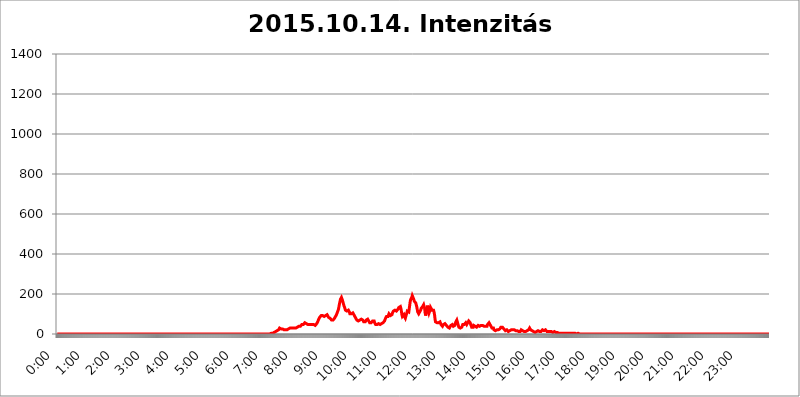
| Category | 2015.10.14. Intenzitás [W/m^2] |
|---|---|
| 0.0 | 0 |
| 0.0006944444444444445 | 0 |
| 0.001388888888888889 | 0 |
| 0.0020833333333333333 | 0 |
| 0.002777777777777778 | 0 |
| 0.003472222222222222 | 0 |
| 0.004166666666666667 | 0 |
| 0.004861111111111111 | 0 |
| 0.005555555555555556 | 0 |
| 0.0062499999999999995 | 0 |
| 0.006944444444444444 | 0 |
| 0.007638888888888889 | 0 |
| 0.008333333333333333 | 0 |
| 0.009027777777777779 | 0 |
| 0.009722222222222222 | 0 |
| 0.010416666666666666 | 0 |
| 0.011111111111111112 | 0 |
| 0.011805555555555555 | 0 |
| 0.012499999999999999 | 0 |
| 0.013194444444444444 | 0 |
| 0.013888888888888888 | 0 |
| 0.014583333333333332 | 0 |
| 0.015277777777777777 | 0 |
| 0.015972222222222224 | 0 |
| 0.016666666666666666 | 0 |
| 0.017361111111111112 | 0 |
| 0.018055555555555557 | 0 |
| 0.01875 | 0 |
| 0.019444444444444445 | 0 |
| 0.02013888888888889 | 0 |
| 0.020833333333333332 | 0 |
| 0.02152777777777778 | 0 |
| 0.022222222222222223 | 0 |
| 0.02291666666666667 | 0 |
| 0.02361111111111111 | 0 |
| 0.024305555555555556 | 0 |
| 0.024999999999999998 | 0 |
| 0.025694444444444447 | 0 |
| 0.02638888888888889 | 0 |
| 0.027083333333333334 | 0 |
| 0.027777777777777776 | 0 |
| 0.02847222222222222 | 0 |
| 0.029166666666666664 | 0 |
| 0.029861111111111113 | 0 |
| 0.030555555555555555 | 0 |
| 0.03125 | 0 |
| 0.03194444444444445 | 0 |
| 0.03263888888888889 | 0 |
| 0.03333333333333333 | 0 |
| 0.034027777777777775 | 0 |
| 0.034722222222222224 | 0 |
| 0.035416666666666666 | 0 |
| 0.036111111111111115 | 0 |
| 0.03680555555555556 | 0 |
| 0.0375 | 0 |
| 0.03819444444444444 | 0 |
| 0.03888888888888889 | 0 |
| 0.03958333333333333 | 0 |
| 0.04027777777777778 | 0 |
| 0.04097222222222222 | 0 |
| 0.041666666666666664 | 0 |
| 0.042361111111111106 | 0 |
| 0.04305555555555556 | 0 |
| 0.043750000000000004 | 0 |
| 0.044444444444444446 | 0 |
| 0.04513888888888889 | 0 |
| 0.04583333333333334 | 0 |
| 0.04652777777777778 | 0 |
| 0.04722222222222222 | 0 |
| 0.04791666666666666 | 0 |
| 0.04861111111111111 | 0 |
| 0.049305555555555554 | 0 |
| 0.049999999999999996 | 0 |
| 0.05069444444444445 | 0 |
| 0.051388888888888894 | 0 |
| 0.052083333333333336 | 0 |
| 0.05277777777777778 | 0 |
| 0.05347222222222222 | 0 |
| 0.05416666666666667 | 0 |
| 0.05486111111111111 | 0 |
| 0.05555555555555555 | 0 |
| 0.05625 | 0 |
| 0.05694444444444444 | 0 |
| 0.057638888888888885 | 0 |
| 0.05833333333333333 | 0 |
| 0.05902777777777778 | 0 |
| 0.059722222222222225 | 0 |
| 0.06041666666666667 | 0 |
| 0.061111111111111116 | 0 |
| 0.06180555555555556 | 0 |
| 0.0625 | 0 |
| 0.06319444444444444 | 0 |
| 0.06388888888888888 | 0 |
| 0.06458333333333334 | 0 |
| 0.06527777777777778 | 0 |
| 0.06597222222222222 | 0 |
| 0.06666666666666667 | 0 |
| 0.06736111111111111 | 0 |
| 0.06805555555555555 | 0 |
| 0.06874999999999999 | 0 |
| 0.06944444444444443 | 0 |
| 0.07013888888888889 | 0 |
| 0.07083333333333333 | 0 |
| 0.07152777777777779 | 0 |
| 0.07222222222222223 | 0 |
| 0.07291666666666667 | 0 |
| 0.07361111111111111 | 0 |
| 0.07430555555555556 | 0 |
| 0.075 | 0 |
| 0.07569444444444444 | 0 |
| 0.0763888888888889 | 0 |
| 0.07708333333333334 | 0 |
| 0.07777777777777778 | 0 |
| 0.07847222222222222 | 0 |
| 0.07916666666666666 | 0 |
| 0.0798611111111111 | 0 |
| 0.08055555555555556 | 0 |
| 0.08125 | 0 |
| 0.08194444444444444 | 0 |
| 0.08263888888888889 | 0 |
| 0.08333333333333333 | 0 |
| 0.08402777777777777 | 0 |
| 0.08472222222222221 | 0 |
| 0.08541666666666665 | 0 |
| 0.08611111111111112 | 0 |
| 0.08680555555555557 | 0 |
| 0.08750000000000001 | 0 |
| 0.08819444444444445 | 0 |
| 0.08888888888888889 | 0 |
| 0.08958333333333333 | 0 |
| 0.09027777777777778 | 0 |
| 0.09097222222222222 | 0 |
| 0.09166666666666667 | 0 |
| 0.09236111111111112 | 0 |
| 0.09305555555555556 | 0 |
| 0.09375 | 0 |
| 0.09444444444444444 | 0 |
| 0.09513888888888888 | 0 |
| 0.09583333333333333 | 0 |
| 0.09652777777777777 | 0 |
| 0.09722222222222222 | 0 |
| 0.09791666666666667 | 0 |
| 0.09861111111111111 | 0 |
| 0.09930555555555555 | 0 |
| 0.09999999999999999 | 0 |
| 0.10069444444444443 | 0 |
| 0.1013888888888889 | 0 |
| 0.10208333333333335 | 0 |
| 0.10277777777777779 | 0 |
| 0.10347222222222223 | 0 |
| 0.10416666666666667 | 0 |
| 0.10486111111111111 | 0 |
| 0.10555555555555556 | 0 |
| 0.10625 | 0 |
| 0.10694444444444444 | 0 |
| 0.1076388888888889 | 0 |
| 0.10833333333333334 | 0 |
| 0.10902777777777778 | 0 |
| 0.10972222222222222 | 0 |
| 0.1111111111111111 | 0 |
| 0.11180555555555556 | 0 |
| 0.11180555555555556 | 0 |
| 0.1125 | 0 |
| 0.11319444444444444 | 0 |
| 0.11388888888888889 | 0 |
| 0.11458333333333333 | 0 |
| 0.11527777777777777 | 0 |
| 0.11597222222222221 | 0 |
| 0.11666666666666665 | 0 |
| 0.1173611111111111 | 0 |
| 0.11805555555555557 | 0 |
| 0.11944444444444445 | 0 |
| 0.12013888888888889 | 0 |
| 0.12083333333333333 | 0 |
| 0.12152777777777778 | 0 |
| 0.12222222222222223 | 0 |
| 0.12291666666666667 | 0 |
| 0.12291666666666667 | 0 |
| 0.12361111111111112 | 0 |
| 0.12430555555555556 | 0 |
| 0.125 | 0 |
| 0.12569444444444444 | 0 |
| 0.12638888888888888 | 0 |
| 0.12708333333333333 | 0 |
| 0.16875 | 0 |
| 0.12847222222222224 | 0 |
| 0.12916666666666668 | 0 |
| 0.12986111111111112 | 0 |
| 0.13055555555555556 | 0 |
| 0.13125 | 0 |
| 0.13194444444444445 | 0 |
| 0.1326388888888889 | 0 |
| 0.13333333333333333 | 0 |
| 0.13402777777777777 | 0 |
| 0.13402777777777777 | 0 |
| 0.13472222222222222 | 0 |
| 0.13541666666666666 | 0 |
| 0.1361111111111111 | 0 |
| 0.13749999999999998 | 0 |
| 0.13819444444444443 | 0 |
| 0.1388888888888889 | 0 |
| 0.13958333333333334 | 0 |
| 0.14027777777777778 | 0 |
| 0.14097222222222222 | 0 |
| 0.14166666666666666 | 0 |
| 0.1423611111111111 | 0 |
| 0.14305555555555557 | 0 |
| 0.14375000000000002 | 0 |
| 0.14444444444444446 | 0 |
| 0.1451388888888889 | 0 |
| 0.1451388888888889 | 0 |
| 0.14652777777777778 | 0 |
| 0.14722222222222223 | 0 |
| 0.14791666666666667 | 0 |
| 0.1486111111111111 | 0 |
| 0.14930555555555555 | 0 |
| 0.15 | 0 |
| 0.15069444444444444 | 0 |
| 0.15138888888888888 | 0 |
| 0.15208333333333332 | 0 |
| 0.15277777777777776 | 0 |
| 0.15347222222222223 | 0 |
| 0.15416666666666667 | 0 |
| 0.15486111111111112 | 0 |
| 0.15555555555555556 | 0 |
| 0.15625 | 0 |
| 0.15694444444444444 | 0 |
| 0.15763888888888888 | 0 |
| 0.15833333333333333 | 0 |
| 0.15902777777777777 | 0 |
| 0.15972222222222224 | 0 |
| 0.16041666666666668 | 0 |
| 0.16111111111111112 | 0 |
| 0.16180555555555556 | 0 |
| 0.1625 | 0 |
| 0.16319444444444445 | 0 |
| 0.1638888888888889 | 0 |
| 0.16458333333333333 | 0 |
| 0.16527777777777777 | 0 |
| 0.16597222222222222 | 0 |
| 0.16666666666666666 | 0 |
| 0.1673611111111111 | 0 |
| 0.16805555555555554 | 0 |
| 0.16874999999999998 | 0 |
| 0.16944444444444443 | 0 |
| 0.17013888888888887 | 0 |
| 0.1708333333333333 | 0 |
| 0.17152777777777775 | 0 |
| 0.17222222222222225 | 0 |
| 0.1729166666666667 | 0 |
| 0.17361111111111113 | 0 |
| 0.17430555555555557 | 0 |
| 0.17500000000000002 | 0 |
| 0.17569444444444446 | 0 |
| 0.1763888888888889 | 0 |
| 0.17708333333333334 | 0 |
| 0.17777777777777778 | 0 |
| 0.17847222222222223 | 0 |
| 0.17916666666666667 | 0 |
| 0.1798611111111111 | 0 |
| 0.18055555555555555 | 0 |
| 0.18125 | 0 |
| 0.18194444444444444 | 0 |
| 0.1826388888888889 | 0 |
| 0.18333333333333335 | 0 |
| 0.1840277777777778 | 0 |
| 0.18472222222222223 | 0 |
| 0.18541666666666667 | 0 |
| 0.18611111111111112 | 0 |
| 0.18680555555555556 | 0 |
| 0.1875 | 0 |
| 0.18819444444444444 | 0 |
| 0.18888888888888888 | 0 |
| 0.18958333333333333 | 0 |
| 0.19027777777777777 | 0 |
| 0.1909722222222222 | 0 |
| 0.19166666666666665 | 0 |
| 0.19236111111111112 | 0 |
| 0.19305555555555554 | 0 |
| 0.19375 | 0 |
| 0.19444444444444445 | 0 |
| 0.1951388888888889 | 0 |
| 0.19583333333333333 | 0 |
| 0.19652777777777777 | 0 |
| 0.19722222222222222 | 0 |
| 0.19791666666666666 | 0 |
| 0.1986111111111111 | 0 |
| 0.19930555555555554 | 0 |
| 0.19999999999999998 | 0 |
| 0.20069444444444443 | 0 |
| 0.20138888888888887 | 0 |
| 0.2020833333333333 | 0 |
| 0.2027777777777778 | 0 |
| 0.2034722222222222 | 0 |
| 0.2041666666666667 | 0 |
| 0.20486111111111113 | 0 |
| 0.20555555555555557 | 0 |
| 0.20625000000000002 | 0 |
| 0.20694444444444446 | 0 |
| 0.2076388888888889 | 0 |
| 0.20833333333333334 | 0 |
| 0.20902777777777778 | 0 |
| 0.20972222222222223 | 0 |
| 0.21041666666666667 | 0 |
| 0.2111111111111111 | 0 |
| 0.21180555555555555 | 0 |
| 0.2125 | 0 |
| 0.21319444444444444 | 0 |
| 0.2138888888888889 | 0 |
| 0.21458333333333335 | 0 |
| 0.2152777777777778 | 0 |
| 0.21597222222222223 | 0 |
| 0.21666666666666667 | 0 |
| 0.21736111111111112 | 0 |
| 0.21805555555555556 | 0 |
| 0.21875 | 0 |
| 0.21944444444444444 | 0 |
| 0.22013888888888888 | 0 |
| 0.22083333333333333 | 0 |
| 0.22152777777777777 | 0 |
| 0.2222222222222222 | 0 |
| 0.22291666666666665 | 0 |
| 0.2236111111111111 | 0 |
| 0.22430555555555556 | 0 |
| 0.225 | 0 |
| 0.22569444444444445 | 0 |
| 0.2263888888888889 | 0 |
| 0.22708333333333333 | 0 |
| 0.22777777777777777 | 0 |
| 0.22847222222222222 | 0 |
| 0.22916666666666666 | 0 |
| 0.2298611111111111 | 0 |
| 0.23055555555555554 | 0 |
| 0.23124999999999998 | 0 |
| 0.23194444444444443 | 0 |
| 0.23263888888888887 | 0 |
| 0.2333333333333333 | 0 |
| 0.2340277777777778 | 0 |
| 0.2347222222222222 | 0 |
| 0.2354166666666667 | 0 |
| 0.23611111111111113 | 0 |
| 0.23680555555555557 | 0 |
| 0.23750000000000002 | 0 |
| 0.23819444444444446 | 0 |
| 0.2388888888888889 | 0 |
| 0.23958333333333334 | 0 |
| 0.24027777777777778 | 0 |
| 0.24097222222222223 | 0 |
| 0.24166666666666667 | 0 |
| 0.2423611111111111 | 0 |
| 0.24305555555555555 | 0 |
| 0.24375 | 0 |
| 0.24444444444444446 | 0 |
| 0.24513888888888888 | 0 |
| 0.24583333333333335 | 0 |
| 0.2465277777777778 | 0 |
| 0.24722222222222223 | 0 |
| 0.24791666666666667 | 0 |
| 0.24861111111111112 | 0 |
| 0.24930555555555556 | 0 |
| 0.25 | 0 |
| 0.25069444444444444 | 0 |
| 0.2513888888888889 | 0 |
| 0.2520833333333333 | 0 |
| 0.25277777777777777 | 0 |
| 0.2534722222222222 | 0 |
| 0.25416666666666665 | 0 |
| 0.2548611111111111 | 0 |
| 0.2555555555555556 | 0 |
| 0.25625000000000003 | 0 |
| 0.2569444444444445 | 0 |
| 0.2576388888888889 | 0 |
| 0.25833333333333336 | 0 |
| 0.2590277777777778 | 0 |
| 0.25972222222222224 | 0 |
| 0.2604166666666667 | 0 |
| 0.2611111111111111 | 0 |
| 0.26180555555555557 | 0 |
| 0.2625 | 0 |
| 0.26319444444444445 | 0 |
| 0.2638888888888889 | 0 |
| 0.26458333333333334 | 0 |
| 0.2652777777777778 | 0 |
| 0.2659722222222222 | 0 |
| 0.26666666666666666 | 0 |
| 0.2673611111111111 | 0 |
| 0.26805555555555555 | 0 |
| 0.26875 | 0 |
| 0.26944444444444443 | 0 |
| 0.2701388888888889 | 0 |
| 0.2708333333333333 | 0 |
| 0.27152777777777776 | 0 |
| 0.2722222222222222 | 0 |
| 0.27291666666666664 | 0 |
| 0.2736111111111111 | 0 |
| 0.2743055555555555 | 0 |
| 0.27499999999999997 | 0 |
| 0.27569444444444446 | 0 |
| 0.27638888888888885 | 0 |
| 0.27708333333333335 | 0 |
| 0.2777777777777778 | 0 |
| 0.27847222222222223 | 0 |
| 0.2791666666666667 | 0 |
| 0.2798611111111111 | 0 |
| 0.28055555555555556 | 0 |
| 0.28125 | 0 |
| 0.28194444444444444 | 0 |
| 0.2826388888888889 | 0 |
| 0.2833333333333333 | 0 |
| 0.28402777777777777 | 0 |
| 0.2847222222222222 | 0 |
| 0.28541666666666665 | 0 |
| 0.28611111111111115 | 0 |
| 0.28680555555555554 | 0 |
| 0.28750000000000003 | 0 |
| 0.2881944444444445 | 0 |
| 0.2888888888888889 | 0 |
| 0.28958333333333336 | 0 |
| 0.2902777777777778 | 0 |
| 0.29097222222222224 | 0 |
| 0.2916666666666667 | 0 |
| 0.2923611111111111 | 0 |
| 0.29305555555555557 | 0 |
| 0.29375 | 0 |
| 0.29444444444444445 | 0 |
| 0.2951388888888889 | 0 |
| 0.29583333333333334 | 0 |
| 0.2965277777777778 | 0 |
| 0.2972222222222222 | 0 |
| 0.29791666666666666 | 0 |
| 0.2986111111111111 | 0 |
| 0.29930555555555555 | 3.525 |
| 0.3 | 3.525 |
| 0.30069444444444443 | 3.525 |
| 0.3013888888888889 | 3.525 |
| 0.3020833333333333 | 3.525 |
| 0.30277777777777776 | 7.887 |
| 0.3034722222222222 | 7.887 |
| 0.30416666666666664 | 7.887 |
| 0.3048611111111111 | 7.887 |
| 0.3055555555555555 | 12.257 |
| 0.30624999999999997 | 12.257 |
| 0.3069444444444444 | 12.257 |
| 0.3076388888888889 | 16.636 |
| 0.30833333333333335 | 16.636 |
| 0.3090277777777778 | 21.024 |
| 0.30972222222222223 | 21.024 |
| 0.3104166666666667 | 21.024 |
| 0.3111111111111111 | 25.419 |
| 0.31180555555555556 | 29.823 |
| 0.3125 | 29.823 |
| 0.31319444444444444 | 29.823 |
| 0.3138888888888889 | 25.419 |
| 0.3145833333333333 | 21.024 |
| 0.31527777777777777 | 25.419 |
| 0.3159722222222222 | 25.419 |
| 0.31666666666666665 | 21.024 |
| 0.31736111111111115 | 21.024 |
| 0.31805555555555554 | 21.024 |
| 0.31875000000000003 | 21.024 |
| 0.3194444444444445 | 21.024 |
| 0.3201388888888889 | 21.024 |
| 0.32083333333333336 | 21.024 |
| 0.3215277777777778 | 21.024 |
| 0.32222222222222224 | 21.024 |
| 0.3229166666666667 | 21.024 |
| 0.3236111111111111 | 21.024 |
| 0.32430555555555557 | 25.419 |
| 0.325 | 25.419 |
| 0.32569444444444445 | 25.419 |
| 0.3263888888888889 | 29.823 |
| 0.32708333333333334 | 29.823 |
| 0.3277777777777778 | 29.823 |
| 0.3284722222222222 | 29.823 |
| 0.32916666666666666 | 29.823 |
| 0.3298611111111111 | 29.823 |
| 0.33055555555555555 | 29.823 |
| 0.33125 | 29.823 |
| 0.33194444444444443 | 29.823 |
| 0.3326388888888889 | 29.823 |
| 0.3333333333333333 | 29.823 |
| 0.3340277777777778 | 29.823 |
| 0.3347222222222222 | 29.823 |
| 0.3354166666666667 | 29.823 |
| 0.3361111111111111 | 34.234 |
| 0.3368055555555556 | 34.234 |
| 0.33749999999999997 | 34.234 |
| 0.33819444444444446 | 38.653 |
| 0.33888888888888885 | 38.653 |
| 0.33958333333333335 | 38.653 |
| 0.34027777777777773 | 38.653 |
| 0.34097222222222223 | 38.653 |
| 0.3416666666666666 | 43.079 |
| 0.3423611111111111 | 43.079 |
| 0.3430555555555555 | 47.511 |
| 0.34375 | 47.511 |
| 0.3444444444444445 | 47.511 |
| 0.3451388888888889 | 47.511 |
| 0.3458333333333334 | 51.951 |
| 0.34652777777777777 | 47.511 |
| 0.34722222222222227 | 56.398 |
| 0.34791666666666665 | 56.398 |
| 0.34861111111111115 | 56.398 |
| 0.34930555555555554 | 51.951 |
| 0.35000000000000003 | 51.951 |
| 0.3506944444444444 | 47.511 |
| 0.3513888888888889 | 47.511 |
| 0.3520833333333333 | 47.511 |
| 0.3527777777777778 | 47.511 |
| 0.3534722222222222 | 47.511 |
| 0.3541666666666667 | 47.511 |
| 0.3548611111111111 | 47.511 |
| 0.35555555555555557 | 47.511 |
| 0.35625 | 47.511 |
| 0.35694444444444445 | 47.511 |
| 0.3576388888888889 | 47.511 |
| 0.35833333333333334 | 47.511 |
| 0.3590277777777778 | 47.511 |
| 0.3597222222222222 | 47.511 |
| 0.36041666666666666 | 43.079 |
| 0.3611111111111111 | 43.079 |
| 0.36180555555555555 | 43.079 |
| 0.3625 | 47.511 |
| 0.36319444444444443 | 47.511 |
| 0.3638888888888889 | 51.951 |
| 0.3645833333333333 | 56.398 |
| 0.3652777777777778 | 60.85 |
| 0.3659722222222222 | 65.31 |
| 0.3666666666666667 | 74.246 |
| 0.3673611111111111 | 78.722 |
| 0.3680555555555556 | 83.205 |
| 0.36874999999999997 | 83.205 |
| 0.36944444444444446 | 87.692 |
| 0.37013888888888885 | 92.184 |
| 0.37083333333333335 | 92.184 |
| 0.37152777777777773 | 92.184 |
| 0.37222222222222223 | 92.184 |
| 0.3729166666666666 | 92.184 |
| 0.3736111111111111 | 87.692 |
| 0.3743055555555555 | 87.692 |
| 0.375 | 87.692 |
| 0.3756944444444445 | 92.184 |
| 0.3763888888888889 | 92.184 |
| 0.3770833333333334 | 96.682 |
| 0.37777777777777777 | 96.682 |
| 0.37847222222222227 | 96.682 |
| 0.37916666666666665 | 92.184 |
| 0.37986111111111115 | 92.184 |
| 0.38055555555555554 | 83.205 |
| 0.38125000000000003 | 87.692 |
| 0.3819444444444444 | 83.205 |
| 0.3826388888888889 | 78.722 |
| 0.3833333333333333 | 74.246 |
| 0.3840277777777778 | 74.246 |
| 0.3847222222222222 | 69.775 |
| 0.3854166666666667 | 69.775 |
| 0.3861111111111111 | 69.775 |
| 0.38680555555555557 | 69.775 |
| 0.3875 | 74.246 |
| 0.38819444444444445 | 74.246 |
| 0.3888888888888889 | 78.722 |
| 0.38958333333333334 | 83.205 |
| 0.3902777777777778 | 87.692 |
| 0.3909722222222222 | 92.184 |
| 0.39166666666666666 | 96.682 |
| 0.3923611111111111 | 101.184 |
| 0.39305555555555555 | 110.201 |
| 0.39375 | 114.716 |
| 0.39444444444444443 | 123.758 |
| 0.3951388888888889 | 137.347 |
| 0.3958333333333333 | 150.964 |
| 0.3965277777777778 | 155.509 |
| 0.3972222222222222 | 173.709 |
| 0.3979166666666667 | 178.264 |
| 0.3986111111111111 | 182.82 |
| 0.3993055555555556 | 178.264 |
| 0.39999999999999997 | 169.156 |
| 0.40069444444444446 | 160.056 |
| 0.40138888888888885 | 150.964 |
| 0.40208333333333335 | 141.884 |
| 0.40277777777777773 | 137.347 |
| 0.40347222222222223 | 128.284 |
| 0.4041666666666666 | 119.235 |
| 0.4048611111111111 | 119.235 |
| 0.4055555555555555 | 114.716 |
| 0.40625 | 114.716 |
| 0.4069444444444445 | 119.235 |
| 0.4076388888888889 | 119.235 |
| 0.4083333333333334 | 119.235 |
| 0.40902777777777777 | 114.716 |
| 0.40972222222222227 | 110.201 |
| 0.41041666666666665 | 101.184 |
| 0.41111111111111115 | 96.682 |
| 0.41180555555555554 | 96.682 |
| 0.41250000000000003 | 101.184 |
| 0.4131944444444444 | 101.184 |
| 0.4138888888888889 | 105.69 |
| 0.4145833333333333 | 105.69 |
| 0.4152777777777778 | 101.184 |
| 0.4159722222222222 | 96.682 |
| 0.4166666666666667 | 92.184 |
| 0.4173611111111111 | 87.692 |
| 0.41805555555555557 | 83.205 |
| 0.41875 | 78.722 |
| 0.41944444444444445 | 74.246 |
| 0.4201388888888889 | 69.775 |
| 0.42083333333333334 | 69.775 |
| 0.4215277777777778 | 65.31 |
| 0.4222222222222222 | 65.31 |
| 0.42291666666666666 | 65.31 |
| 0.4236111111111111 | 65.31 |
| 0.42430555555555555 | 69.775 |
| 0.425 | 74.246 |
| 0.42569444444444443 | 74.246 |
| 0.4263888888888889 | 74.246 |
| 0.4270833333333333 | 74.246 |
| 0.4277777777777778 | 74.246 |
| 0.4284722222222222 | 69.775 |
| 0.4291666666666667 | 65.31 |
| 0.4298611111111111 | 60.85 |
| 0.4305555555555556 | 60.85 |
| 0.43124999999999997 | 60.85 |
| 0.43194444444444446 | 60.85 |
| 0.43263888888888885 | 65.31 |
| 0.43333333333333335 | 69.775 |
| 0.43402777777777773 | 74.246 |
| 0.43472222222222223 | 74.246 |
| 0.4354166666666666 | 74.246 |
| 0.4361111111111111 | 69.775 |
| 0.4368055555555555 | 65.31 |
| 0.4375 | 60.85 |
| 0.4381944444444445 | 56.398 |
| 0.4388888888888889 | 56.398 |
| 0.4395833333333334 | 56.398 |
| 0.44027777777777777 | 56.398 |
| 0.44097222222222227 | 60.85 |
| 0.44166666666666665 | 60.85 |
| 0.44236111111111115 | 65.31 |
| 0.44305555555555554 | 65.31 |
| 0.44375000000000003 | 65.31 |
| 0.4444444444444444 | 65.31 |
| 0.4451388888888889 | 56.398 |
| 0.4458333333333333 | 51.951 |
| 0.4465277777777778 | 47.511 |
| 0.4472222222222222 | 47.511 |
| 0.4479166666666667 | 43.079 |
| 0.4486111111111111 | 47.511 |
| 0.44930555555555557 | 47.511 |
| 0.45 | 51.951 |
| 0.45069444444444445 | 51.951 |
| 0.4513888888888889 | 56.398 |
| 0.45208333333333334 | 51.951 |
| 0.4527777777777778 | 47.511 |
| 0.4534722222222222 | 47.511 |
| 0.45416666666666666 | 51.951 |
| 0.4548611111111111 | 51.951 |
| 0.45555555555555555 | 51.951 |
| 0.45625 | 51.951 |
| 0.45694444444444443 | 56.398 |
| 0.4576388888888889 | 56.398 |
| 0.4583333333333333 | 60.85 |
| 0.4590277777777778 | 65.31 |
| 0.4597222222222222 | 69.775 |
| 0.4604166666666667 | 78.722 |
| 0.4611111111111111 | 83.205 |
| 0.4618055555555556 | 87.692 |
| 0.46249999999999997 | 83.205 |
| 0.46319444444444446 | 83.205 |
| 0.46388888888888885 | 87.692 |
| 0.46458333333333335 | 92.184 |
| 0.46527777777777773 | 101.184 |
| 0.46597222222222223 | 101.184 |
| 0.4666666666666666 | 96.682 |
| 0.4673611111111111 | 92.184 |
| 0.4680555555555555 | 92.184 |
| 0.46875 | 92.184 |
| 0.4694444444444445 | 96.682 |
| 0.4701388888888889 | 105.69 |
| 0.4708333333333334 | 110.201 |
| 0.47152777777777777 | 114.716 |
| 0.47222222222222227 | 119.235 |
| 0.47291666666666665 | 119.235 |
| 0.47361111111111115 | 119.235 |
| 0.47430555555555554 | 114.716 |
| 0.47500000000000003 | 114.716 |
| 0.4756944444444444 | 114.716 |
| 0.4763888888888889 | 114.716 |
| 0.4770833333333333 | 119.235 |
| 0.4777777777777778 | 123.758 |
| 0.4784722222222222 | 128.284 |
| 0.4791666666666667 | 132.814 |
| 0.4798611111111111 | 132.814 |
| 0.48055555555555557 | 137.347 |
| 0.48125 | 137.347 |
| 0.48194444444444445 | 128.284 |
| 0.4826388888888889 | 114.716 |
| 0.48333333333333334 | 96.682 |
| 0.4840277777777778 | 87.692 |
| 0.4847222222222222 | 87.692 |
| 0.48541666666666666 | 92.184 |
| 0.4861111111111111 | 96.682 |
| 0.48680555555555555 | 87.692 |
| 0.4875 | 83.205 |
| 0.48819444444444443 | 78.722 |
| 0.4888888888888889 | 87.692 |
| 0.4895833333333333 | 96.682 |
| 0.4902777777777778 | 105.69 |
| 0.4909722222222222 | 114.716 |
| 0.4916666666666667 | 119.235 |
| 0.4923611111111111 | 114.716 |
| 0.4930555555555556 | 110.201 |
| 0.49374999999999997 | 128.284 |
| 0.49444444444444446 | 146.423 |
| 0.49513888888888885 | 164.605 |
| 0.49583333333333335 | 173.709 |
| 0.49652777777777773 | 178.264 |
| 0.49722222222222223 | 182.82 |
| 0.4979166666666666 | 191.937 |
| 0.4986111111111111 | 191.937 |
| 0.4993055555555555 | 187.378 |
| 0.5 | 173.709 |
| 0.5006944444444444 | 164.605 |
| 0.5013888888888889 | 164.605 |
| 0.5020833333333333 | 160.056 |
| 0.5027777777777778 | 155.509 |
| 0.5034722222222222 | 146.423 |
| 0.5041666666666667 | 137.347 |
| 0.5048611111111111 | 123.758 |
| 0.5055555555555555 | 110.201 |
| 0.50625 | 105.69 |
| 0.5069444444444444 | 101.184 |
| 0.5076388888888889 | 105.69 |
| 0.5083333333333333 | 110.201 |
| 0.5090277777777777 | 114.716 |
| 0.5097222222222222 | 119.235 |
| 0.5104166666666666 | 128.284 |
| 0.5111111111111112 | 123.758 |
| 0.5118055555555555 | 128.284 |
| 0.5125000000000001 | 137.347 |
| 0.5131944444444444 | 141.884 |
| 0.513888888888889 | 146.423 |
| 0.5145833333333333 | 141.884 |
| 0.5152777777777778 | 128.284 |
| 0.5159722222222222 | 105.69 |
| 0.5166666666666667 | 92.184 |
| 0.517361111111111 | 96.682 |
| 0.5180555555555556 | 110.201 |
| 0.5187499999999999 | 132.814 |
| 0.5194444444444445 | 141.884 |
| 0.5201388888888888 | 141.884 |
| 0.5208333333333334 | 119.235 |
| 0.5215277777777778 | 105.69 |
| 0.5222222222222223 | 105.69 |
| 0.5229166666666667 | 119.235 |
| 0.5236111111111111 | 132.814 |
| 0.5243055555555556 | 137.347 |
| 0.525 | 128.284 |
| 0.5256944444444445 | 119.235 |
| 0.5263888888888889 | 119.235 |
| 0.5270833333333333 | 119.235 |
| 0.5277777777777778 | 119.235 |
| 0.5284722222222222 | 110.201 |
| 0.5291666666666667 | 96.682 |
| 0.5298611111111111 | 74.246 |
| 0.5305555555555556 | 60.85 |
| 0.53125 | 60.85 |
| 0.5319444444444444 | 56.398 |
| 0.5326388888888889 | 56.398 |
| 0.5333333333333333 | 56.398 |
| 0.5340277777777778 | 51.951 |
| 0.5347222222222222 | 56.398 |
| 0.5354166666666667 | 56.398 |
| 0.5361111111111111 | 60.85 |
| 0.5368055555555555 | 60.85 |
| 0.5375 | 56.398 |
| 0.5381944444444444 | 47.511 |
| 0.5388888888888889 | 43.079 |
| 0.5395833333333333 | 43.079 |
| 0.5402777777777777 | 38.653 |
| 0.5409722222222222 | 43.079 |
| 0.5416666666666666 | 47.511 |
| 0.5423611111111112 | 51.951 |
| 0.5430555555555555 | 47.511 |
| 0.5437500000000001 | 51.951 |
| 0.5444444444444444 | 51.951 |
| 0.545138888888889 | 47.511 |
| 0.5458333333333333 | 43.079 |
| 0.5465277777777778 | 38.653 |
| 0.5472222222222222 | 38.653 |
| 0.5479166666666667 | 34.234 |
| 0.548611111111111 | 34.234 |
| 0.5493055555555556 | 29.823 |
| 0.5499999999999999 | 29.823 |
| 0.5506944444444445 | 29.823 |
| 0.5513888888888888 | 34.234 |
| 0.5520833333333334 | 43.079 |
| 0.5527777777777778 | 47.511 |
| 0.5534722222222223 | 47.511 |
| 0.5541666666666667 | 47.511 |
| 0.5548611111111111 | 43.079 |
| 0.5555555555555556 | 38.653 |
| 0.55625 | 38.653 |
| 0.5569444444444445 | 38.653 |
| 0.5576388888888889 | 43.079 |
| 0.5583333333333333 | 51.951 |
| 0.5590277777777778 | 60.85 |
| 0.5597222222222222 | 65.31 |
| 0.5604166666666667 | 69.775 |
| 0.5611111111111111 | 60.85 |
| 0.5618055555555556 | 56.398 |
| 0.5625 | 43.079 |
| 0.5631944444444444 | 34.234 |
| 0.5638888888888889 | 29.823 |
| 0.5645833333333333 | 29.823 |
| 0.5652777777777778 | 29.823 |
| 0.5659722222222222 | 29.823 |
| 0.5666666666666667 | 29.823 |
| 0.5673611111111111 | 34.234 |
| 0.5680555555555555 | 38.653 |
| 0.56875 | 47.511 |
| 0.5694444444444444 | 51.951 |
| 0.5701388888888889 | 47.511 |
| 0.5708333333333333 | 47.511 |
| 0.5715277777777777 | 47.511 |
| 0.5722222222222222 | 47.511 |
| 0.5729166666666666 | 56.398 |
| 0.5736111111111112 | 51.951 |
| 0.5743055555555555 | 47.511 |
| 0.5750000000000001 | 47.511 |
| 0.5756944444444444 | 56.398 |
| 0.576388888888889 | 60.85 |
| 0.5770833333333333 | 65.31 |
| 0.5777777777777778 | 69.775 |
| 0.5784722222222222 | 65.31 |
| 0.5791666666666667 | 56.398 |
| 0.579861111111111 | 47.511 |
| 0.5805555555555556 | 43.079 |
| 0.5812499999999999 | 34.234 |
| 0.5819444444444445 | 29.823 |
| 0.5826388888888888 | 29.823 |
| 0.5833333333333334 | 34.234 |
| 0.5840277777777778 | 43.079 |
| 0.5847222222222223 | 47.511 |
| 0.5854166666666667 | 43.079 |
| 0.5861111111111111 | 38.653 |
| 0.5868055555555556 | 38.653 |
| 0.5875 | 34.234 |
| 0.5881944444444445 | 34.234 |
| 0.5888888888888889 | 38.653 |
| 0.5895833333333333 | 38.653 |
| 0.5902777777777778 | 43.079 |
| 0.5909722222222222 | 38.653 |
| 0.5916666666666667 | 38.653 |
| 0.5923611111111111 | 38.653 |
| 0.5930555555555556 | 38.653 |
| 0.59375 | 43.079 |
| 0.5944444444444444 | 43.079 |
| 0.5951388888888889 | 47.511 |
| 0.5958333333333333 | 47.511 |
| 0.5965277777777778 | 43.079 |
| 0.5972222222222222 | 38.653 |
| 0.5979166666666667 | 38.653 |
| 0.5986111111111111 | 38.653 |
| 0.5993055555555555 | 38.653 |
| 0.6 | 38.653 |
| 0.6006944444444444 | 38.653 |
| 0.6013888888888889 | 34.234 |
| 0.6020833333333333 | 38.653 |
| 0.6027777777777777 | 38.653 |
| 0.6034722222222222 | 47.511 |
| 0.6041666666666666 | 51.951 |
| 0.6048611111111112 | 51.951 |
| 0.6055555555555555 | 56.398 |
| 0.6062500000000001 | 51.951 |
| 0.6069444444444444 | 47.511 |
| 0.607638888888889 | 47.511 |
| 0.6083333333333333 | 38.653 |
| 0.6090277777777778 | 34.234 |
| 0.6097222222222222 | 29.823 |
| 0.6104166666666667 | 25.419 |
| 0.611111111111111 | 29.823 |
| 0.6118055555555556 | 29.823 |
| 0.6124999999999999 | 21.024 |
| 0.6131944444444445 | 21.024 |
| 0.6138888888888888 | 16.636 |
| 0.6145833333333334 | 16.636 |
| 0.6152777777777778 | 21.024 |
| 0.6159722222222223 | 21.024 |
| 0.6166666666666667 | 21.024 |
| 0.6173611111111111 | 21.024 |
| 0.6180555555555556 | 16.636 |
| 0.61875 | 21.024 |
| 0.6194444444444445 | 21.024 |
| 0.6201388888888889 | 25.419 |
| 0.6208333333333333 | 25.419 |
| 0.6215277777777778 | 29.823 |
| 0.6222222222222222 | 34.234 |
| 0.6229166666666667 | 34.234 |
| 0.6236111111111111 | 29.823 |
| 0.6243055555555556 | 34.234 |
| 0.625 | 29.823 |
| 0.6256944444444444 | 29.823 |
| 0.6263888888888889 | 25.419 |
| 0.6270833333333333 | 21.024 |
| 0.6277777777777778 | 21.024 |
| 0.6284722222222222 | 16.636 |
| 0.6291666666666667 | 16.636 |
| 0.6298611111111111 | 21.024 |
| 0.6305555555555555 | 21.024 |
| 0.63125 | 21.024 |
| 0.6319444444444444 | 16.636 |
| 0.6326388888888889 | 12.257 |
| 0.6333333333333333 | 12.257 |
| 0.6340277777777777 | 16.636 |
| 0.6347222222222222 | 16.636 |
| 0.6354166666666666 | 16.636 |
| 0.6361111111111112 | 16.636 |
| 0.6368055555555555 | 21.024 |
| 0.6375000000000001 | 21.024 |
| 0.6381944444444444 | 21.024 |
| 0.638888888888889 | 21.024 |
| 0.6395833333333333 | 21.024 |
| 0.6402777777777778 | 21.024 |
| 0.6409722222222222 | 21.024 |
| 0.6416666666666667 | 21.024 |
| 0.642361111111111 | 16.636 |
| 0.6430555555555556 | 16.636 |
| 0.6437499999999999 | 21.024 |
| 0.6444444444444445 | 21.024 |
| 0.6451388888888888 | 16.636 |
| 0.6458333333333334 | 12.257 |
| 0.6465277777777778 | 12.257 |
| 0.6472222222222223 | 12.257 |
| 0.6479166666666667 | 12.257 |
| 0.6486111111111111 | 12.257 |
| 0.6493055555555556 | 12.257 |
| 0.65 | 16.636 |
| 0.6506944444444445 | 21.024 |
| 0.6513888888888889 | 21.024 |
| 0.6520833333333333 | 21.024 |
| 0.6527777777777778 | 16.636 |
| 0.6534722222222222 | 16.636 |
| 0.6541666666666667 | 16.636 |
| 0.6548611111111111 | 12.257 |
| 0.6555555555555556 | 12.257 |
| 0.65625 | 12.257 |
| 0.6569444444444444 | 12.257 |
| 0.6576388888888889 | 12.257 |
| 0.6583333333333333 | 16.636 |
| 0.6590277777777778 | 16.636 |
| 0.6597222222222222 | 16.636 |
| 0.6604166666666667 | 21.024 |
| 0.6611111111111111 | 21.024 |
| 0.6618055555555555 | 25.419 |
| 0.6625 | 29.823 |
| 0.6631944444444444 | 25.419 |
| 0.6638888888888889 | 21.024 |
| 0.6645833333333333 | 21.024 |
| 0.6652777777777777 | 21.024 |
| 0.6659722222222222 | 16.636 |
| 0.6666666666666666 | 12.257 |
| 0.6673611111111111 | 12.257 |
| 0.6680555555555556 | 12.257 |
| 0.6687500000000001 | 12.257 |
| 0.6694444444444444 | 12.257 |
| 0.6701388888888888 | 7.887 |
| 0.6708333333333334 | 7.887 |
| 0.6715277777777778 | 7.887 |
| 0.6722222222222222 | 12.257 |
| 0.6729166666666666 | 12.257 |
| 0.6736111111111112 | 12.257 |
| 0.6743055555555556 | 16.636 |
| 0.6749999999999999 | 16.636 |
| 0.6756944444444444 | 16.636 |
| 0.6763888888888889 | 12.257 |
| 0.6770833333333334 | 16.636 |
| 0.6777777777777777 | 16.636 |
| 0.6784722222222223 | 12.257 |
| 0.6791666666666667 | 12.257 |
| 0.6798611111111111 | 16.636 |
| 0.6805555555555555 | 21.024 |
| 0.68125 | 21.024 |
| 0.6819444444444445 | 21.024 |
| 0.6826388888888889 | 16.636 |
| 0.6833333333333332 | 16.636 |
| 0.6840277777777778 | 16.636 |
| 0.6847222222222222 | 21.024 |
| 0.6854166666666667 | 16.636 |
| 0.686111111111111 | 16.636 |
| 0.6868055555555556 | 12.257 |
| 0.6875 | 12.257 |
| 0.6881944444444444 | 12.257 |
| 0.688888888888889 | 12.257 |
| 0.6895833333333333 | 12.257 |
| 0.6902777777777778 | 7.887 |
| 0.6909722222222222 | 12.257 |
| 0.6916666666666668 | 7.887 |
| 0.6923611111111111 | 7.887 |
| 0.6930555555555555 | 12.257 |
| 0.69375 | 12.257 |
| 0.6944444444444445 | 12.257 |
| 0.6951388888888889 | 7.887 |
| 0.6958333333333333 | 12.257 |
| 0.6965277777777777 | 12.257 |
| 0.6972222222222223 | 12.257 |
| 0.6979166666666666 | 7.887 |
| 0.6986111111111111 | 7.887 |
| 0.6993055555555556 | 7.887 |
| 0.7000000000000001 | 7.887 |
| 0.7006944444444444 | 7.887 |
| 0.7013888888888888 | 7.887 |
| 0.7020833333333334 | 3.525 |
| 0.7027777777777778 | 3.525 |
| 0.7034722222222222 | 3.525 |
| 0.7041666666666666 | 3.525 |
| 0.7048611111111112 | 3.525 |
| 0.7055555555555556 | 3.525 |
| 0.7062499999999999 | 3.525 |
| 0.7069444444444444 | 3.525 |
| 0.7076388888888889 | 3.525 |
| 0.7083333333333334 | 3.525 |
| 0.7090277777777777 | 3.525 |
| 0.7097222222222223 | 3.525 |
| 0.7104166666666667 | 3.525 |
| 0.7111111111111111 | 3.525 |
| 0.7118055555555555 | 3.525 |
| 0.7125 | 3.525 |
| 0.7131944444444445 | 3.525 |
| 0.7138888888888889 | 3.525 |
| 0.7145833333333332 | 3.525 |
| 0.7152777777777778 | 3.525 |
| 0.7159722222222222 | 3.525 |
| 0.7166666666666667 | 3.525 |
| 0.717361111111111 | 3.525 |
| 0.7180555555555556 | 3.525 |
| 0.71875 | 3.525 |
| 0.7194444444444444 | 3.525 |
| 0.720138888888889 | 3.525 |
| 0.7208333333333333 | 3.525 |
| 0.7215277777777778 | 0 |
| 0.7222222222222222 | 3.525 |
| 0.7229166666666668 | 3.525 |
| 0.7236111111111111 | 0 |
| 0.7243055555555555 | 3.525 |
| 0.725 | 3.525 |
| 0.7256944444444445 | 3.525 |
| 0.7263888888888889 | 3.525 |
| 0.7270833333333333 | 0 |
| 0.7277777777777777 | 3.525 |
| 0.7284722222222223 | 0 |
| 0.7291666666666666 | 0 |
| 0.7298611111111111 | 3.525 |
| 0.7305555555555556 | 3.525 |
| 0.7312500000000001 | 0 |
| 0.7319444444444444 | 3.525 |
| 0.7326388888888888 | 0 |
| 0.7333333333333334 | 0 |
| 0.7340277777777778 | 0 |
| 0.7347222222222222 | 0 |
| 0.7354166666666666 | 0 |
| 0.7361111111111112 | 0 |
| 0.7368055555555556 | 0 |
| 0.7374999999999999 | 0 |
| 0.7381944444444444 | 0 |
| 0.7388888888888889 | 0 |
| 0.7395833333333334 | 0 |
| 0.7402777777777777 | 0 |
| 0.7409722222222223 | 0 |
| 0.7416666666666667 | 0 |
| 0.7423611111111111 | 0 |
| 0.7430555555555555 | 0 |
| 0.74375 | 0 |
| 0.7444444444444445 | 0 |
| 0.7451388888888889 | 0 |
| 0.7458333333333332 | 0 |
| 0.7465277777777778 | 0 |
| 0.7472222222222222 | 0 |
| 0.7479166666666667 | 0 |
| 0.748611111111111 | 0 |
| 0.7493055555555556 | 0 |
| 0.75 | 0 |
| 0.7506944444444444 | 0 |
| 0.751388888888889 | 0 |
| 0.7520833333333333 | 0 |
| 0.7527777777777778 | 0 |
| 0.7534722222222222 | 0 |
| 0.7541666666666668 | 0 |
| 0.7548611111111111 | 0 |
| 0.7555555555555555 | 0 |
| 0.75625 | 0 |
| 0.7569444444444445 | 0 |
| 0.7576388888888889 | 0 |
| 0.7583333333333333 | 0 |
| 0.7590277777777777 | 0 |
| 0.7597222222222223 | 0 |
| 0.7604166666666666 | 0 |
| 0.7611111111111111 | 0 |
| 0.7618055555555556 | 0 |
| 0.7625000000000001 | 0 |
| 0.7631944444444444 | 0 |
| 0.7638888888888888 | 0 |
| 0.7645833333333334 | 0 |
| 0.7652777777777778 | 0 |
| 0.7659722222222222 | 0 |
| 0.7666666666666666 | 0 |
| 0.7673611111111112 | 0 |
| 0.7680555555555556 | 0 |
| 0.7687499999999999 | 0 |
| 0.7694444444444444 | 0 |
| 0.7701388888888889 | 0 |
| 0.7708333333333334 | 0 |
| 0.7715277777777777 | 0 |
| 0.7722222222222223 | 0 |
| 0.7729166666666667 | 0 |
| 0.7736111111111111 | 0 |
| 0.7743055555555555 | 0 |
| 0.775 | 0 |
| 0.7756944444444445 | 0 |
| 0.7763888888888889 | 0 |
| 0.7770833333333332 | 0 |
| 0.7777777777777778 | 0 |
| 0.7784722222222222 | 0 |
| 0.7791666666666667 | 0 |
| 0.779861111111111 | 0 |
| 0.7805555555555556 | 0 |
| 0.78125 | 0 |
| 0.7819444444444444 | 0 |
| 0.782638888888889 | 0 |
| 0.7833333333333333 | 0 |
| 0.7840277777777778 | 0 |
| 0.7847222222222222 | 0 |
| 0.7854166666666668 | 0 |
| 0.7861111111111111 | 0 |
| 0.7868055555555555 | 0 |
| 0.7875 | 0 |
| 0.7881944444444445 | 0 |
| 0.7888888888888889 | 0 |
| 0.7895833333333333 | 0 |
| 0.7902777777777777 | 0 |
| 0.7909722222222223 | 0 |
| 0.7916666666666666 | 0 |
| 0.7923611111111111 | 0 |
| 0.7930555555555556 | 0 |
| 0.7937500000000001 | 0 |
| 0.7944444444444444 | 0 |
| 0.7951388888888888 | 0 |
| 0.7958333333333334 | 0 |
| 0.7965277777777778 | 0 |
| 0.7972222222222222 | 0 |
| 0.7979166666666666 | 0 |
| 0.7986111111111112 | 0 |
| 0.7993055555555556 | 0 |
| 0.7999999999999999 | 0 |
| 0.8006944444444444 | 0 |
| 0.8013888888888889 | 0 |
| 0.8020833333333334 | 0 |
| 0.8027777777777777 | 0 |
| 0.8034722222222223 | 0 |
| 0.8041666666666667 | 0 |
| 0.8048611111111111 | 0 |
| 0.8055555555555555 | 0 |
| 0.80625 | 0 |
| 0.8069444444444445 | 0 |
| 0.8076388888888889 | 0 |
| 0.8083333333333332 | 0 |
| 0.8090277777777778 | 0 |
| 0.8097222222222222 | 0 |
| 0.8104166666666667 | 0 |
| 0.811111111111111 | 0 |
| 0.8118055555555556 | 0 |
| 0.8125 | 0 |
| 0.8131944444444444 | 0 |
| 0.813888888888889 | 0 |
| 0.8145833333333333 | 0 |
| 0.8152777777777778 | 0 |
| 0.8159722222222222 | 0 |
| 0.8166666666666668 | 0 |
| 0.8173611111111111 | 0 |
| 0.8180555555555555 | 0 |
| 0.81875 | 0 |
| 0.8194444444444445 | 0 |
| 0.8201388888888889 | 0 |
| 0.8208333333333333 | 0 |
| 0.8215277777777777 | 0 |
| 0.8222222222222223 | 0 |
| 0.8229166666666666 | 0 |
| 0.8236111111111111 | 0 |
| 0.8243055555555556 | 0 |
| 0.8250000000000001 | 0 |
| 0.8256944444444444 | 0 |
| 0.8263888888888888 | 0 |
| 0.8270833333333334 | 0 |
| 0.8277777777777778 | 0 |
| 0.8284722222222222 | 0 |
| 0.8291666666666666 | 0 |
| 0.8298611111111112 | 0 |
| 0.8305555555555556 | 0 |
| 0.8312499999999999 | 0 |
| 0.8319444444444444 | 0 |
| 0.8326388888888889 | 0 |
| 0.8333333333333334 | 0 |
| 0.8340277777777777 | 0 |
| 0.8347222222222223 | 0 |
| 0.8354166666666667 | 0 |
| 0.8361111111111111 | 0 |
| 0.8368055555555555 | 0 |
| 0.8375 | 0 |
| 0.8381944444444445 | 0 |
| 0.8388888888888889 | 0 |
| 0.8395833333333332 | 0 |
| 0.8402777777777778 | 0 |
| 0.8409722222222222 | 0 |
| 0.8416666666666667 | 0 |
| 0.842361111111111 | 0 |
| 0.8430555555555556 | 0 |
| 0.84375 | 0 |
| 0.8444444444444444 | 0 |
| 0.845138888888889 | 0 |
| 0.8458333333333333 | 0 |
| 0.8465277777777778 | 0 |
| 0.8472222222222222 | 0 |
| 0.8479166666666668 | 0 |
| 0.8486111111111111 | 0 |
| 0.8493055555555555 | 0 |
| 0.85 | 0 |
| 0.8506944444444445 | 0 |
| 0.8513888888888889 | 0 |
| 0.8520833333333333 | 0 |
| 0.8527777777777777 | 0 |
| 0.8534722222222223 | 0 |
| 0.8541666666666666 | 0 |
| 0.8548611111111111 | 0 |
| 0.8555555555555556 | 0 |
| 0.8562500000000001 | 0 |
| 0.8569444444444444 | 0 |
| 0.8576388888888888 | 0 |
| 0.8583333333333334 | 0 |
| 0.8590277777777778 | 0 |
| 0.8597222222222222 | 0 |
| 0.8604166666666666 | 0 |
| 0.8611111111111112 | 0 |
| 0.8618055555555556 | 0 |
| 0.8624999999999999 | 0 |
| 0.8631944444444444 | 0 |
| 0.8638888888888889 | 0 |
| 0.8645833333333334 | 0 |
| 0.8652777777777777 | 0 |
| 0.8659722222222223 | 0 |
| 0.8666666666666667 | 0 |
| 0.8673611111111111 | 0 |
| 0.8680555555555555 | 0 |
| 0.86875 | 0 |
| 0.8694444444444445 | 0 |
| 0.8701388888888889 | 0 |
| 0.8708333333333332 | 0 |
| 0.8715277777777778 | 0 |
| 0.8722222222222222 | 0 |
| 0.8729166666666667 | 0 |
| 0.873611111111111 | 0 |
| 0.8743055555555556 | 0 |
| 0.875 | 0 |
| 0.8756944444444444 | 0 |
| 0.876388888888889 | 0 |
| 0.8770833333333333 | 0 |
| 0.8777777777777778 | 0 |
| 0.8784722222222222 | 0 |
| 0.8791666666666668 | 0 |
| 0.8798611111111111 | 0 |
| 0.8805555555555555 | 0 |
| 0.88125 | 0 |
| 0.8819444444444445 | 0 |
| 0.8826388888888889 | 0 |
| 0.8833333333333333 | 0 |
| 0.8840277777777777 | 0 |
| 0.8847222222222223 | 0 |
| 0.8854166666666666 | 0 |
| 0.8861111111111111 | 0 |
| 0.8868055555555556 | 0 |
| 0.8875000000000001 | 0 |
| 0.8881944444444444 | 0 |
| 0.8888888888888888 | 0 |
| 0.8895833333333334 | 0 |
| 0.8902777777777778 | 0 |
| 0.8909722222222222 | 0 |
| 0.8916666666666666 | 0 |
| 0.8923611111111112 | 0 |
| 0.8930555555555556 | 0 |
| 0.8937499999999999 | 0 |
| 0.8944444444444444 | 0 |
| 0.8951388888888889 | 0 |
| 0.8958333333333334 | 0 |
| 0.8965277777777777 | 0 |
| 0.8972222222222223 | 0 |
| 0.8979166666666667 | 0 |
| 0.8986111111111111 | 0 |
| 0.8993055555555555 | 0 |
| 0.9 | 0 |
| 0.9006944444444445 | 0 |
| 0.9013888888888889 | 0 |
| 0.9020833333333332 | 0 |
| 0.9027777777777778 | 0 |
| 0.9034722222222222 | 0 |
| 0.9041666666666667 | 0 |
| 0.904861111111111 | 0 |
| 0.9055555555555556 | 0 |
| 0.90625 | 0 |
| 0.9069444444444444 | 0 |
| 0.907638888888889 | 0 |
| 0.9083333333333333 | 0 |
| 0.9090277777777778 | 0 |
| 0.9097222222222222 | 0 |
| 0.9104166666666668 | 0 |
| 0.9111111111111111 | 0 |
| 0.9118055555555555 | 0 |
| 0.9125 | 0 |
| 0.9131944444444445 | 0 |
| 0.9138888888888889 | 0 |
| 0.9145833333333333 | 0 |
| 0.9152777777777777 | 0 |
| 0.9159722222222223 | 0 |
| 0.9166666666666666 | 0 |
| 0.9173611111111111 | 0 |
| 0.9180555555555556 | 0 |
| 0.9187500000000001 | 0 |
| 0.9194444444444444 | 0 |
| 0.9201388888888888 | 0 |
| 0.9208333333333334 | 0 |
| 0.9215277777777778 | 0 |
| 0.9222222222222222 | 0 |
| 0.9229166666666666 | 0 |
| 0.9236111111111112 | 0 |
| 0.9243055555555556 | 0 |
| 0.9249999999999999 | 0 |
| 0.9256944444444444 | 0 |
| 0.9263888888888889 | 0 |
| 0.9270833333333334 | 0 |
| 0.9277777777777777 | 0 |
| 0.9284722222222223 | 0 |
| 0.9291666666666667 | 0 |
| 0.9298611111111111 | 0 |
| 0.9305555555555555 | 0 |
| 0.93125 | 0 |
| 0.9319444444444445 | 0 |
| 0.9326388888888889 | 0 |
| 0.9333333333333332 | 0 |
| 0.9340277777777778 | 0 |
| 0.9347222222222222 | 0 |
| 0.9354166666666667 | 0 |
| 0.936111111111111 | 0 |
| 0.9368055555555556 | 0 |
| 0.9375 | 0 |
| 0.9381944444444444 | 0 |
| 0.938888888888889 | 0 |
| 0.9395833333333333 | 0 |
| 0.9402777777777778 | 0 |
| 0.9409722222222222 | 0 |
| 0.9416666666666668 | 0 |
| 0.9423611111111111 | 0 |
| 0.9430555555555555 | 0 |
| 0.94375 | 0 |
| 0.9444444444444445 | 0 |
| 0.9451388888888889 | 0 |
| 0.9458333333333333 | 0 |
| 0.9465277777777777 | 0 |
| 0.9472222222222223 | 0 |
| 0.9479166666666666 | 0 |
| 0.9486111111111111 | 0 |
| 0.9493055555555556 | 0 |
| 0.9500000000000001 | 0 |
| 0.9506944444444444 | 0 |
| 0.9513888888888888 | 0 |
| 0.9520833333333334 | 0 |
| 0.9527777777777778 | 0 |
| 0.9534722222222222 | 0 |
| 0.9541666666666666 | 0 |
| 0.9548611111111112 | 0 |
| 0.9555555555555556 | 0 |
| 0.9562499999999999 | 0 |
| 0.9569444444444444 | 0 |
| 0.9576388888888889 | 0 |
| 0.9583333333333334 | 0 |
| 0.9590277777777777 | 0 |
| 0.9597222222222223 | 0 |
| 0.9604166666666667 | 0 |
| 0.9611111111111111 | 0 |
| 0.9618055555555555 | 0 |
| 0.9625 | 0 |
| 0.9631944444444445 | 0 |
| 0.9638888888888889 | 0 |
| 0.9645833333333332 | 0 |
| 0.9652777777777778 | 0 |
| 0.9659722222222222 | 0 |
| 0.9666666666666667 | 0 |
| 0.967361111111111 | 0 |
| 0.9680555555555556 | 0 |
| 0.96875 | 0 |
| 0.9694444444444444 | 0 |
| 0.970138888888889 | 0 |
| 0.9708333333333333 | 0 |
| 0.9715277777777778 | 0 |
| 0.9722222222222222 | 0 |
| 0.9729166666666668 | 0 |
| 0.9736111111111111 | 0 |
| 0.9743055555555555 | 0 |
| 0.975 | 0 |
| 0.9756944444444445 | 0 |
| 0.9763888888888889 | 0 |
| 0.9770833333333333 | 0 |
| 0.9777777777777777 | 0 |
| 0.9784722222222223 | 0 |
| 0.9791666666666666 | 0 |
| 0.9798611111111111 | 0 |
| 0.9805555555555556 | 0 |
| 0.9812500000000001 | 0 |
| 0.9819444444444444 | 0 |
| 0.9826388888888888 | 0 |
| 0.9833333333333334 | 0 |
| 0.9840277777777778 | 0 |
| 0.9847222222222222 | 0 |
| 0.9854166666666666 | 0 |
| 0.9861111111111112 | 0 |
| 0.9868055555555556 | 0 |
| 0.9874999999999999 | 0 |
| 0.9881944444444444 | 0 |
| 0.9888888888888889 | 0 |
| 0.9895833333333334 | 0 |
| 0.9902777777777777 | 0 |
| 0.9909722222222223 | 0 |
| 0.9916666666666667 | 0 |
| 0.9923611111111111 | 0 |
| 0.9930555555555555 | 0 |
| 0.99375 | 0 |
| 0.9944444444444445 | 0 |
| 0.9951388888888889 | 0 |
| 0.9958333333333332 | 0 |
| 0.9965277777777778 | 0 |
| 0.9972222222222222 | 0 |
| 0.9979166666666667 | 0 |
| 0.998611111111111 | 0 |
| 0.9993055555555556 | 0 |